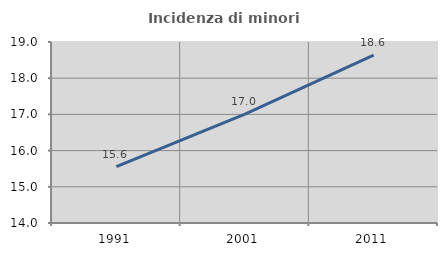
| Category | Incidenza di minori stranieri |
|---|---|
| 1991.0 | 15.556 |
| 2001.0 | 17.007 |
| 2011.0 | 18.636 |